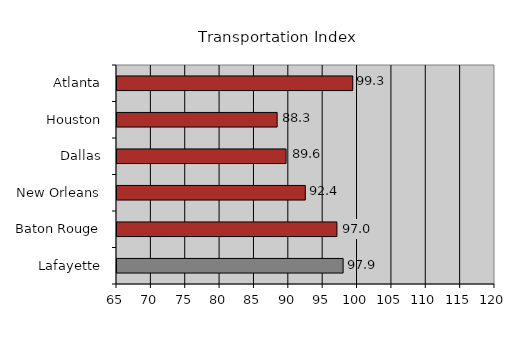
| Category | 97.9 |
|---|---|
| Lafayette | 97.9 |
| Baton Rouge | 97 |
| New Orleans | 92.4 |
| Dallas | 89.6 |
| Houston | 88.3 |
| Atlanta | 99.3 |